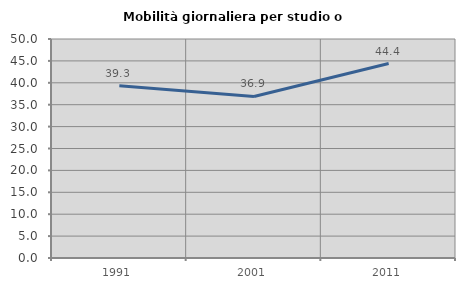
| Category | Mobilità giornaliera per studio o lavoro |
|---|---|
| 1991.0 | 39.323 |
| 2001.0 | 36.89 |
| 2011.0 | 44.396 |